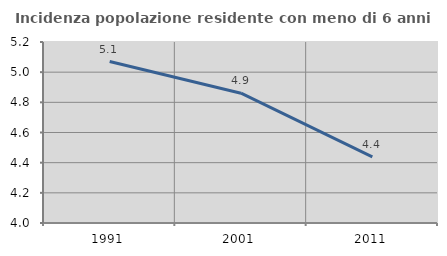
| Category | Incidenza popolazione residente con meno di 6 anni |
|---|---|
| 1991.0 | 5.07 |
| 2001.0 | 4.861 |
| 2011.0 | 4.439 |